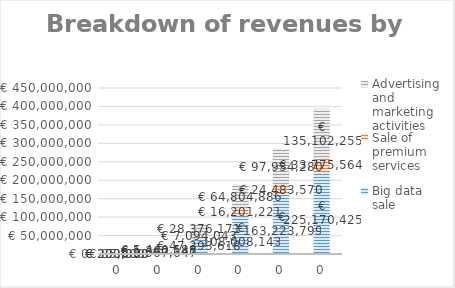
| Category | Big data sale | Sale of premium services | Advertising and marketing activities |
|---|---|---|---|
| 0 | 333333.333 | 85000 | 200000 |
| 1 | 9067647.006 | 1360147.051 | 5440588.203 |
| 2 | 47293617.555 | 7094042.633 | 28376170.533 |
| 3 | 108008143.197 | 16201221.48 | 64804885.918 |
| 4 | 163223799.292 | 24483569.894 | 97934279.575 |
| 5 | 225170425.5 | 33775563.825 | 135102255.3 |